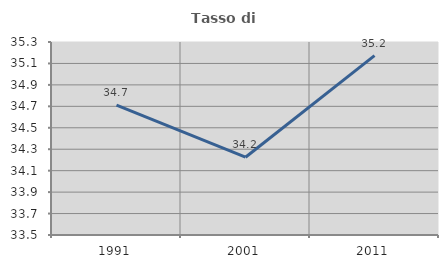
| Category | Tasso di occupazione   |
|---|---|
| 1991.0 | 34.71 |
| 2001.0 | 34.225 |
| 2011.0 | 35.173 |